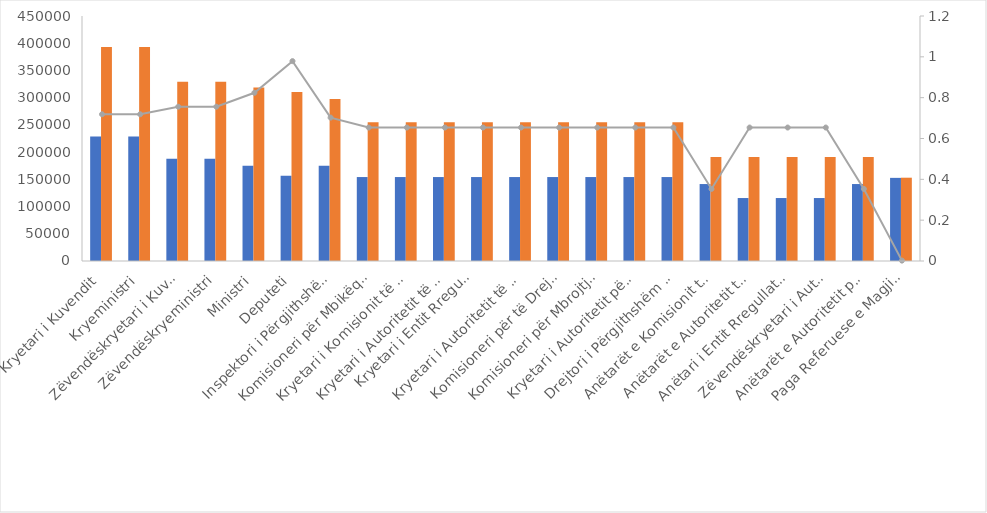
| Category | Paga Bruto Ishte | Paga Bruto planifikohet |
|---|---|---|
| Kryetari i Kuvendit | 228730 | 393125 |
| Kryeministri | 228730 | 393125 |
| Zëvendëskryetari i Kuvendit | 187610 | 329375 |
| Zëvendëskryeministri | 187610 | 329375 |
| Ministri | 174760 | 318750 |
| Deputeti | 156770 | 310250 |
| Inspektori i Përgjithshëm i Inspektoratit të Lartë të Deklarimit dhe Kontrollit të Pasurive dhe Konfliktit të Interesave | 174760 | 297500 |
| Komisioneri për Mbikëqyrjen e Shërbimit Civil  | 154200 | 255000 |
| Kryetari i Komisionit të Autoritetit të Konkurrencës | 154200 | 255000 |
| Kryetari i Autoritetit të Komunikimeve Elektronike dhe Postare | 154200 | 255000 |
| Kryetari i Entit Rregullator të Sektorit të Furnizimit me Ujë dhe
Largimit e Përpunimit të Ujërave të Ndotura | 154200 | 255000 |
| Kryetari i Autoritetit të Mediave Audiovizive | 154200 | 255000 |
| Komisioneri për të Drejtën e Informimit dhe Mbrojtjen e të Dhënave Personale | 154200 | 255000 |
| Komisioneri për Mbrojtjen nga Diskriminimi | 154200 | 255000 |
| Kryetari i Autoritetit për Informimin mbi Dokumentet e ish Sigurimit të Shtetit | 154200 | 255000 |
| Drejtori i Përgjithshëm i Institutit të Statistikave | 154200 | 255000 |
| Anëtarët e Komisionit të Konkurrencës | 141350 | 191250 |
| Anëtarët e Autoritetit të Komunikimeve Elektronike dhe Postare  | 115650 | 191250 |
| Anëtari i Entit Rregullator të Sektorit të Furnizimit me Ujë dhe Largimit e Përpunimit të Ujërave të Ndotura  | 115650 | 191250 |
| Zëvendëskryetari i Autoritetit të Mediave Audiovizive | 115650 | 191250 |
| Anëtarët e Autoritetit për Informimin mbi Dokumentet e ish Sigurimit të Shtetit | 141350 | 191250 |
| Paga Referuese e Magjistratit | 152700 | 153000 |